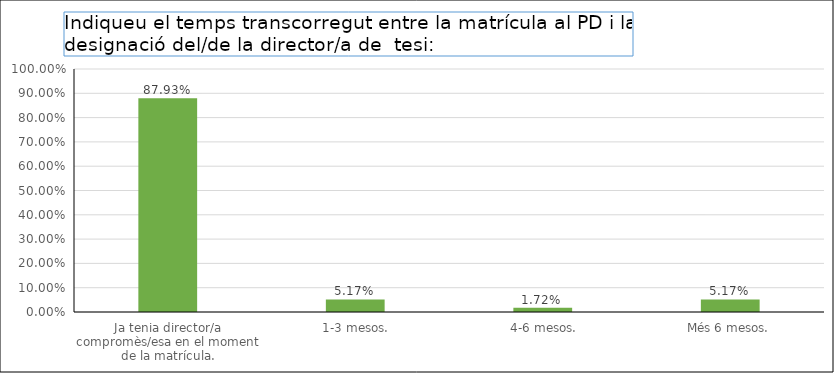
| Category | Series 0 |
|---|---|
| Ja tenia director/a compromès/esa en el moment de la matrícula. | 0.879 |
|  1-3 mesos. | 0.052 |
|  4-6 mesos. | 0.017 |
| Més 6 mesos. | 0.052 |